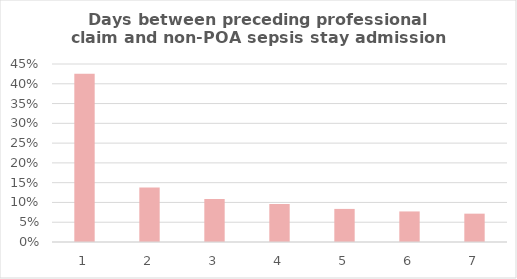
| Category | Number of days between preceeding professional claim and Acute IP admission |
|---|---|
| 1.0 | 0.425 |
| 2.0 | 0.138 |
| 3.0 | 0.108 |
| 4.0 | 0.096 |
| 5.0 | 0.084 |
| 6.0 | 0.077 |
| 7.0 | 0.072 |